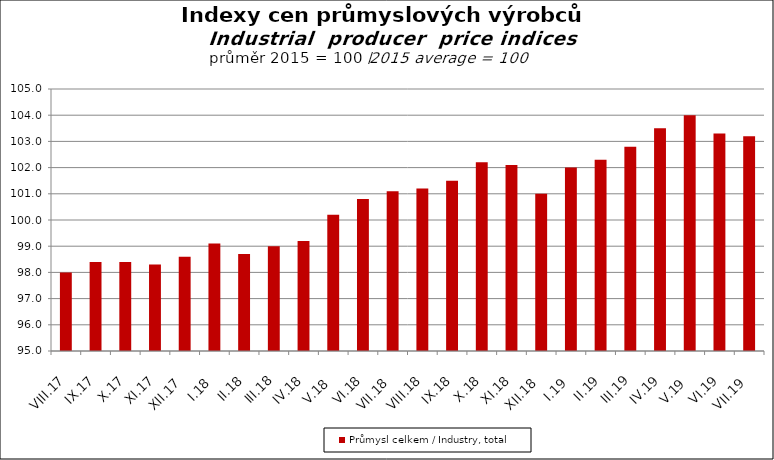
| Category | Průmysl celkem / Industry, total |
|---|---|
| VIII.17 | 98 |
| IX.17 | 98.4 |
| X.17 | 98.4 |
| XI.17 | 98.3 |
| XII.17 | 98.6 |
| I.18 | 99.1 |
| II.18 | 98.7 |
| III.18 | 99 |
| IV.18 | 99.2 |
| V.18 | 100.2 |
| VI.18 | 100.8 |
| VII.18 | 101.1 |
| VIII.18 | 101.2 |
| IX.18 | 101.5 |
| X.18 | 102.2 |
| XI.18 | 102.1 |
| XII.18 | 101 |
| I.19 | 102 |
| II.19 | 102.3 |
| III.19 | 102.8 |
| IV.19 | 103.5 |
| V.19 | 104 |
| VI.19 | 103.3 |
| VII.19 | 103.2 |